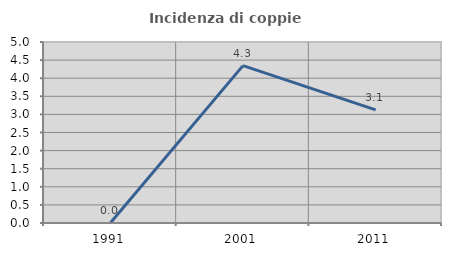
| Category | Incidenza di coppie miste |
|---|---|
| 1991.0 | 0 |
| 2001.0 | 4.348 |
| 2011.0 | 3.125 |